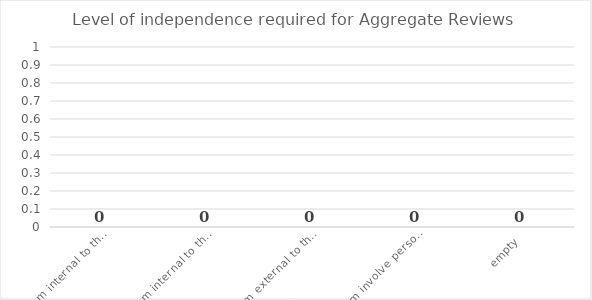
| Category | Series 0 |
|---|---|
| a. Team internal to the team/department/NAS Operational Region | 0 |
| b. Team internal to the service/hospital/NAS Operational Area | 0 |
| c. Team external to the service/hospital but internal to CHO/HG/NAS Corp Area | 0 |
| d. Team involve persons external to the CHO/HG/NAS Directorate | 0 |
| empty | 0 |